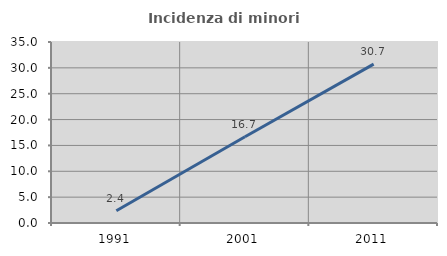
| Category | Incidenza di minori stranieri |
|---|---|
| 1991.0 | 2.381 |
| 2001.0 | 16.667 |
| 2011.0 | 30.714 |